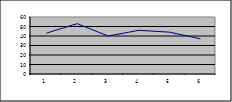
| Category | Series 0 |
|---|---|
| 0 | 43 |
| 1 | 53 |
| 2 | 40 |
| 3 | 46 |
| 4 | 44 |
| 5 | 37 |